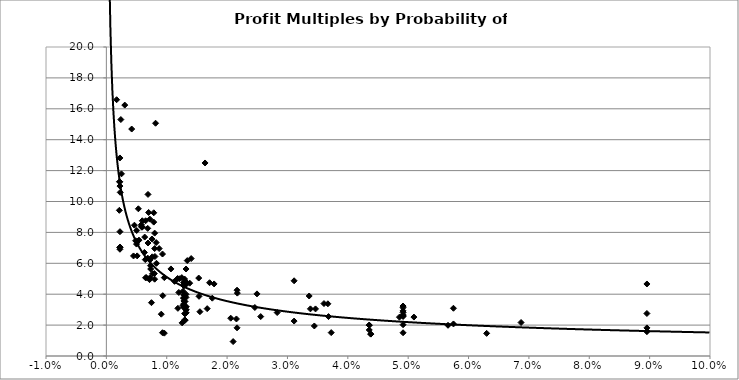
| Category | Profit Multiple |
|---|---|
| 0.01185 | 3.085 |
| 0.00685 | 6.333 |
| 0.015349999999999999 | 3.863 |
| 0.04915 | 3.233 |
| 0.04915 | 3.235 |
| 0.04915 | 3.13 |
| 0.04915 | 2.92 |
| 0.04915 | 1.504 |
| 0.04915 | 2.817 |
| 0.04915 | 2.66 |
| 0.04915 | 2.607 |
| 0.04915 | 2.556 |
| 0.04915 | 2.025 |
| 0.0096 | 5.073 |
| 0.0246 | 3.139 |
| 0.00595 | 8.354 |
| 0.00595 | 8.754 |
| 0.0012000000000000001 | 23.909 |
| 0.0024 | 15.304 |
| 0.036699999999999997 | 3.38 |
| 0.0005 | 47.2 |
| 0.009300000000000001 | 6.6 |
| 0.00485 | 7.458 |
| 0.021 | 0.933 |
| 0.0007900000000000001 | 34.262 |
| 0.005025 | 8.125 |
| 0.025570000000000002 | 2.552 |
| 0.0030499999999999998 | 16.24 |
| 0.0132 | 5.631 |
| 0.017849999999999998 | 4.665 |
| 0.00747 | 3.451 |
| 0.0096 | 1.479 |
| 0.009300000000000001 | 1.505 |
| 0.0338 | 3.05 |
| 0.0368 | 2.552 |
| 0.0045000000000000005 | 6.476 |
| 0.0051 | 6.48 |
| 0.01635 | 12.494 |
| 0.0167 | 3.064 |
| 0.012549999999999999 | 2.145 |
| 0.007350000000000001 | 5.63 |
| 0.00875 | 6.953 |
| 0.02495 | 4.02 |
| 0.0125 | 5.074 |
| 0.007949999999999999 | 5.333 |
| 0.00215 | 9.429 |
| 0.006500000000000001 | 5.06 |
| 0.0206 | 2.447 |
| 0.00805 | 6.44 |
| 0.0118 | 5.017 |
| 0.0017 | 16.588 |
| 0.00635 | 7.698 |
| 0.004399999999999999 | 24.455 |
| 0.006449999999999999 | 6.238 |
| 0.00465 | 8.467 |
| 0.0127 | 3.262 |
| 0.063 | 1.465 |
| 0.00815 | 15.067 |
| 0.0042 | 14.69 |
| 0.00225 | 11 |
| 0.012 | 4.112 |
| 0.00785 | 8.667 |
| 0.03445 | 1.944 |
| 0.006999999999999999 | 9.29 |
| 0.00685 | 8.261 |
| 0.0171 | 4.742 |
| 0.0066 | 5.08 |
| 0.00715 | 4.943 |
| 0.00935 | 3.903 |
| 0.0132 | 3.795 |
| 0.0132 | 2.992 |
| 0.0132 | 2.795 |
| 0.0128 | 3.961 |
| 0.0128 | 4.555 |
| 0.0021999999999999997 | 11.273 |
| 0.005000000000000001 | 7.245 |
| 0.0021999999999999997 | 11.273 |
| 0.0128 | 3.359 |
| 0.0128 | 3.156 |
| 0.0128 | 4.75 |
| 0.0128 | 3.75 |
| 0.0132 | 3.189 |
| 0.0132 | 2.795 |
| 0.0132 | 3.992 |
| 0.0132 | 3.189 |
| 0.0132 | 2.992 |
| 0.01285 | 3.75 |
| 0.01285 | 4.555 |
| 0.01285 | 3.75 |
| 0.01285 | 3.75 |
| 0.01285 | 3.75 |
| 0.0022500000000000003 | 7.045 |
| 0.0022500000000000003 | 8.045 |
| 0.0022500000000000003 | 7.045 |
| 0.0022500000000000003 | 7.045 |
| 0.0022500000000000003 | 7.045 |
| 0.0022500000000000003 | 6.909 |
| 0.013000000000000001 | 2.736 |
| 0.013000000000000001 | 2.341 |
| 0.013000000000000001 | 2.736 |
| 0.0131 | 4.802 |
| 0.0131 | 4.802 |
| 0.0131 | 4.802 |
| 0.0138 | 4.714 |
| 0.0127 | 4.189 |
| 0.0069 | 7.315 |
| 0.0053 | 9.528 |
| 0.0072 | 8.861 |
| 0.00225 | 12.818 |
| 0.006500000000000001 | 8.754 |
| 0.00825 | 7.341 |
| 0.0025 | 11.789 |
| 0.015300000000000001 | 5.046 |
| 0.056600000000000004 | 1.988 |
| 0.0058 | 8.5 |
| 0.005900000000000001 | 8.333 |
| 0.0054 | 7.5 |
| 0.0023 | 10.591 |
| 0.0073100000000000005 | 5.847 |
| 0.007245 | 6.227 |
| 0.0052 | 7.432 |
| 0.0063 | 6.704 |
| 0.0076500000000000005 | 5.324 |
| 0.007600000000000001 | 6.418 |
| 0.006900000000000001 | 10.458 |
| 0.012949999999999998 | 4.983 |
| 0.03465 | 3.047 |
| 0.0155 | 2.867 |
| 0.03725 | 1.513 |
| 0.028300000000000002 | 2.812 |
| 0.00785 | 9.27 |
| 0.013000000000000001 | 3.535 |
| 0.008 | 4.973 |
| 0.01285 | 3.766 |
| 0.01285 | 4.555 |
| 0.01285 | 3.562 |
| 0.013399999999999999 | 6.177 |
| 0.007549999999999999 | 7.574 |
| 0.0083 | 6 |
| 0.0107 | 5.636 |
| 0.0113 | 4.832 |
| 0.0121 | 5 |
| 0.008 | 6.954 |
| 0.01755 | 3.743 |
| 0.01325 | 4.654 |
| 0.013000000000000001 | 3.124 |
| 0.013000000000000001 | 3.124 |
| 0.013000000000000001 | 3.519 |
| 0.02155 | 2.397 |
| 0.04355 | 1.998 |
| 0.04355 | 1.998 |
| 0.04355 | 1.685 |
| 0.0217 | 4.07 |
| 0.013049999999999999 | 2.315 |
| 0.021650000000000003 | 1.824 |
| 0.043800000000000006 | 1.42 |
| 0.043800000000000006 | 1.42 |
| 0.021650000000000003 | 4.259 |
| 0.03605 | 3.394 |
| 0.057499999999999996 | 3.09 |
| 0.057499999999999996 | 2.074 |
| 0.08954999999999999 | 2.751 |
| 0.08954999999999999 | 1.82 |
| 0.08954999999999999 | 4.662 |
| 0.08954999999999999 | 1.589 |
| 0.08954999999999999 | 1.589 |
| 0.0336 | 3.884 |
| 0.1281 | 1.958 |
| 0.1281 | 1.958 |
| 0.050949999999999995 | 2.52 |
| 0.152 | 1.698 |
| 0.0687 | 2.168 |
| 0.048549999999999996 | 2.515 |
| 0.0311 | 4.868 |
| 0.0311 | 2.26 |
| 0.01405 | 6.306 |
| 0.0072 | 23.209 |
| 0.0072 | 5.06 |
| 0.0091 | 2.707 |
| 0.008 | 7.954 |
| 0.0058000000000000005 | 8.4 |